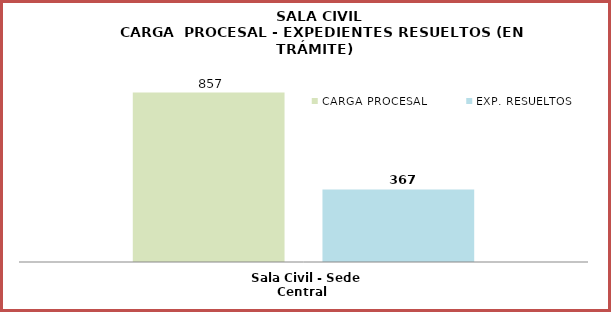
| Category | CARGA PROCESAL | EXP. RESUELTOS |
|---|---|---|
| Sala Civil - Sede Central | 857 | 367 |